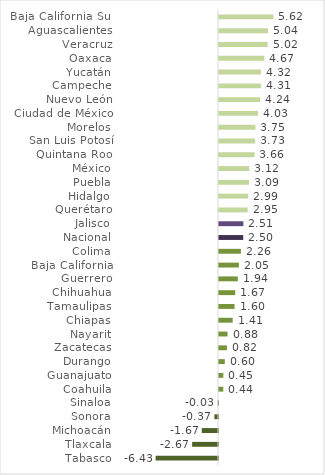
| Category | Series 0 |
|---|---|
| Tabasco | -6.431 |
| Tlaxcala | -2.667 |
| Michoacán | -1.674 |
| Sonora | -0.371 |
| Sinaloa | -0.032 |
| Coahuila | 0.442 |
| Guanajuato | 0.449 |
| Durango | 0.599 |
| Zacatecas | 0.817 |
| Nayarit | 0.88 |
| Chiapas | 1.41 |
| Tamaulipas | 1.602 |
| Chihuahua | 1.671 |
| Guerrero | 1.937 |
| Baja California | 2.049 |
| Colima | 2.258 |
| Nacional | 2.496 |
| Jalisco | 2.512 |
| Querétaro | 2.95 |
| Hidalgo | 2.992 |
| Puebla | 3.088 |
| México | 3.123 |
| Quintana Roo | 3.655 |
| San Luis Potosí | 3.729 |
| Morelos | 3.753 |
| Ciudad de México | 4.028 |
| Nuevo León | 4.244 |
| Campeche | 4.313 |
| Yucatán | 4.318 |
| Oaxaca | 4.67 |
| Veracruz | 5.016 |
| Aguascalientes | 5.036 |
| Baja California Sur | 5.615 |